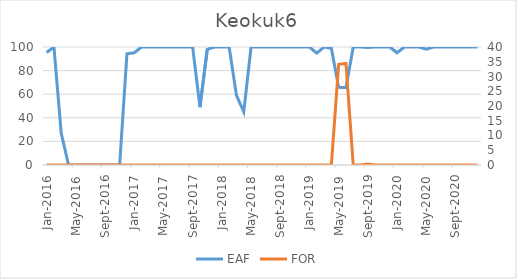
| Category | EAF |
|---|---|
| 2016-01-01 | 95.36 |
| 2016-02-01 | 100 |
| 2016-03-01 | 26.77 |
| 2016-04-01 | 0 |
| 2016-05-01 | 0 |
| 2016-06-01 | 0 |
| 2016-07-01 | 0 |
| 2016-08-01 | 0 |
| 2016-09-01 | 0 |
| 2016-10-01 | 0 |
| 2016-11-01 | 0 |
| 2016-12-01 | 94.29 |
| 2017-01-01 | 95.11 |
| 2017-02-01 | 100 |
| 2017-03-01 | 100 |
| 2017-04-01 | 100 |
| 2017-05-01 | 100 |
| 2017-06-01 | 99.99 |
| 2017-07-01 | 100 |
| 2017-08-01 | 100 |
| 2017-09-01 | 100 |
| 2017-10-01 | 49.09 |
| 2017-11-01 | 98.07 |
| 2017-12-01 | 100 |
| 2018-01-01 | 100 |
| 2018-02-01 | 100 |
| 2018-03-01 | 59.02 |
| 2018-04-01 | 45 |
| 2018-05-01 | 100 |
| 2018-06-01 | 100 |
| 2018-07-01 | 100 |
| 2018-08-01 | 100 |
| 2018-09-01 | 100 |
| 2018-10-01 | 100 |
| 2018-11-01 | 100 |
| 2018-12-01 | 100 |
| 2019-01-01 | 100 |
| 2019-02-01 | 94.79 |
| 2019-03-01 | 100 |
| 2019-04-01 | 99.01 |
| 2019-05-01 | 65.88 |
| 2019-06-01 | 65.58 |
| 2019-07-01 | 100 |
| 2019-08-01 | 100 |
| 2019-09-01 | 99.65 |
| 2019-10-01 | 100 |
| 2019-11-01 | 100 |
| 2019-12-01 | 100 |
| 2020-01-01 | 95.12 |
| 2020-02-01 | 100 |
| 2020-03-01 | 100 |
| 2020-04-01 | 100 |
| 2020-05-01 | 98.12 |
| 2020-06-01 | 100 |
| 2020-07-01 | 100 |
| 2020-08-01 | 100 |
| 2020-09-01 | 100 |
| 2020-10-01 | 100 |
| 2020-11-01 | 100 |
| 2020-12-01 | 100 |